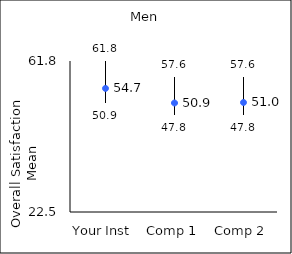
| Category | 25th percentile | 75th percentile | Mean |
|---|---|---|---|
| Your Inst | 50.9 | 61.8 | 54.67 |
| Comp 1 | 47.8 | 57.6 | 50.87 |
| Comp 2 | 47.8 | 57.6 | 51 |